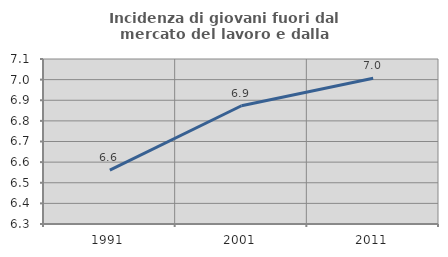
| Category | Incidenza di giovani fuori dal mercato del lavoro e dalla formazione  |
|---|---|
| 1991.0 | 6.561 |
| 2001.0 | 6.873 |
| 2011.0 | 7.006 |